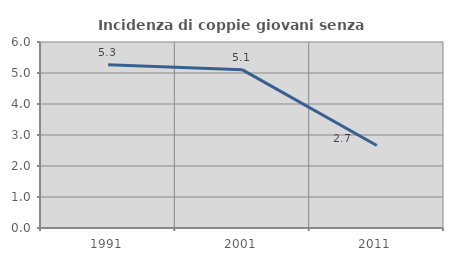
| Category | Incidenza di coppie giovani senza figli |
|---|---|
| 1991.0 | 5.263 |
| 2001.0 | 5.102 |
| 2011.0 | 2.66 |